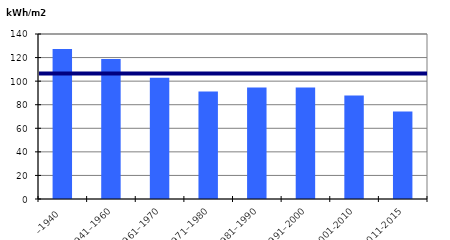
| Category | Byggårskategori |
|---|---|
| –1940 | 127.215 |
| 1941–1960 | 118.78 |
| 1961–1970 | 102.849 |
| 1971–1980 | 91.298 |
| 1981–1990 | 94.575 |
| 1991–2000 | 94.691 |
| 2001-2010 | 87.848 |
| 2011-2015 | 74.24 |